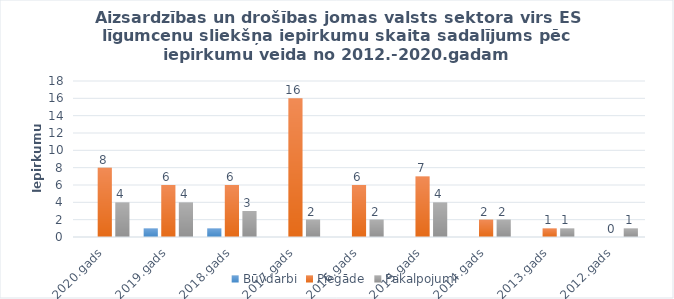
| Category | Būvdarbi | Piegāde | Pakalpojumi |
|---|---|---|---|
| 2020.gads | 0 | 8 | 4 |
| 2019.gads | 1 | 6 | 4 |
| 2018.gads | 1 | 6 | 3 |
| 2017.gads | 0 | 16 | 2 |
| 2016.gads | 0 | 6 | 2 |
| 2015.gads | 0 | 7 | 4 |
| 2014.gads | 0 | 2 | 2 |
| 2013.gads | 0 | 1 | 1 |
| 2012.gads | 0 | 0 | 1 |